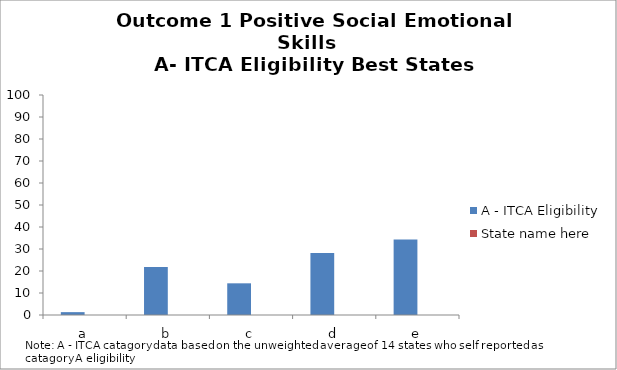
| Category | A - ITCA Eligibility | State name here |
|---|---|---|
| a | 1.3 |  |
| b | 21.8 |  |
| c | 14.4 |  |
| d | 28.2 |  |
| e | 34.3 |  |